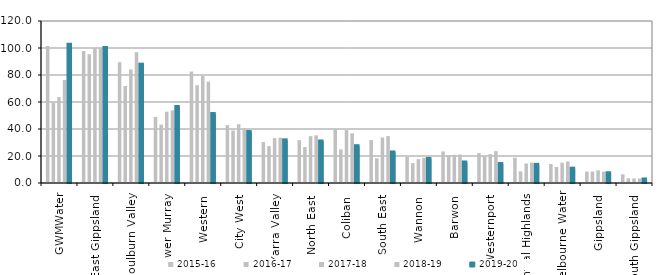
| Category | 2015-16 | 2016-17 | 2017-18 | 2018-19 | 2019-20 |
|---|---|---|---|---|---|
| GWMWater | 101.547 | 59.539 | 63.649 | 76.377 | 102.331 |
| East Gippsland  | 97.825 | 95.408 | 100 | 100 | 100 |
| Goulburn Valley  | 89.491 | 71.84 | 84.117 | 96.817 | 87.65 |
| Lower Murray  | 48.916 | 43.259 | 52.816 | 53.818 | 56.288 |
| Western  | 82.56 | 72.455 | 79.226 | 75.061 | 51.084 |
| City West  | 42.867 | 38.941 | 43.564 | 40.373 | 37.754 |
| Yarra Valley  | 30.337 | 27.345 | 33.245 | 33.607 | 31.588 |
| North East  | 31.749 | 26.643 | 34.702 | 35.333 | 30.741 |
| Coliban  | 39.833 | 24.891 | 39.282 | 36.811 | 27.269 |
| South East  | 31.805 | 18.302 | 33.684 | 34.743 | 22.613 |
| Wannon  | 19.346 | 14.734 | 17.677 | 18.678 | 17.807 |
| Barwon  | 23.364 | 20.722 | 20.921 | 21.093 | 15.202 |
| Westernport  | 22.16 | 19.717 | 21.397 | 23.64 | 14.026 |
| Central Highlands  | 18.781 | 8.609 | 14.439 | 15.067 | 13.434 |
| Melbourne Water | 14.12 | 11.868 | 15.05 | 15.916 | 10.626 |
| Gippsland  | 8.477 | 8.457 | 9.4 | 8.43 | 7.207 |
| South Gippsland  | 6.427 | 3.514 | 3.358 | 3.257 | 2.617 |